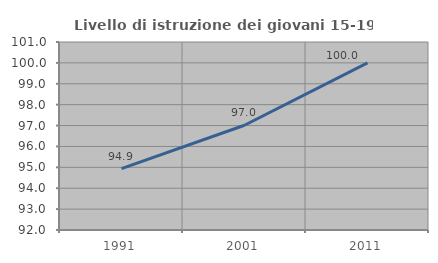
| Category | Livello di istruzione dei giovani 15-19 anni |
|---|---|
| 1991.0 | 94.937 |
| 2001.0 | 97.015 |
| 2011.0 | 100 |